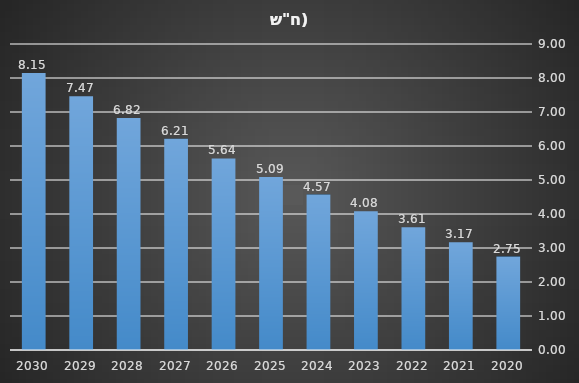
| Category | סה"כ |
|---|---|
| 2020 | 2.747 |
| 2021 | 3.169 |
| 2022 | 3.612 |
| 2023 | 4.079 |
| 2024 | 4.571 |
| 2025 | 5.089 |
| 2026 | 5.635 |
| 2027 | 6.212 |
| 2028 | 6.822 |
| 2029 | 7.466 |
| 2030 | 8.148 |